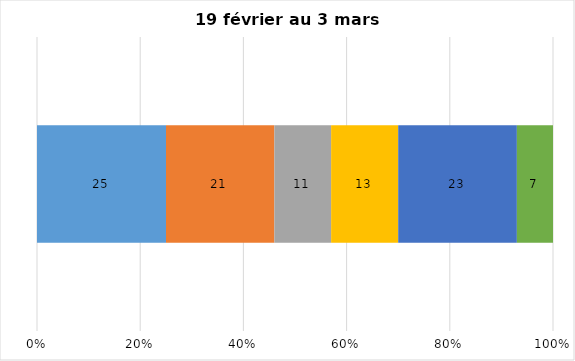
| Category | Plusieurs fois par jour | Une fois par jour | Quelques fois par semaine   | Une fois par semaine ou moins   |  Jamais   |  Je n’utilise pas les médias sociaux |
|---|---|---|---|---|---|---|
| 0 | 25 | 21 | 11 | 13 | 23 | 7 |